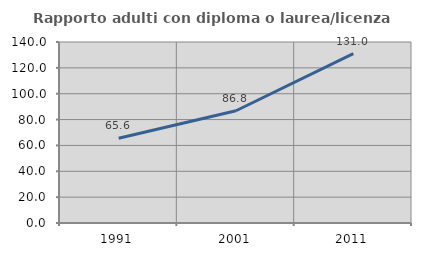
| Category | Rapporto adulti con diploma o laurea/licenza media  |
|---|---|
| 1991.0 | 65.596 |
| 2001.0 | 86.842 |
| 2011.0 | 130.973 |